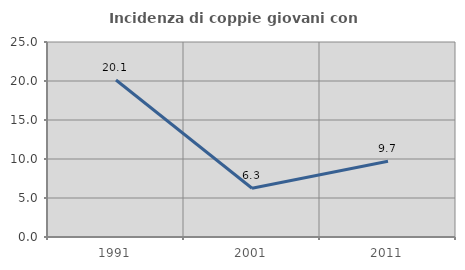
| Category | Incidenza di coppie giovani con figli |
|---|---|
| 1991.0 | 20.122 |
| 2001.0 | 6.25 |
| 2011.0 | 9.722 |